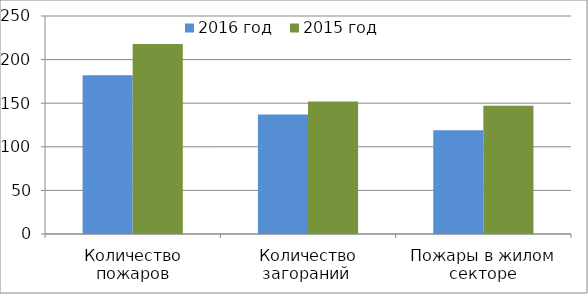
| Category | 2016 год | 2015 год |
|---|---|---|
| Количество пожаров | 182 | 218 |
| Количество загораний  | 137 | 152 |
| Пожары в жилом секторе | 119 | 147 |